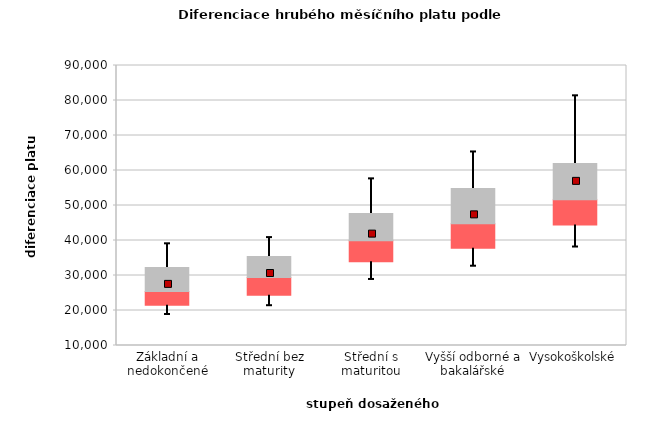
| Category | 0.25 | 0.5 | 0.75 |
|---|---|---|---|
| Základní a nedokončené | 21478.392 | 3965.391 | 6817.841 |
| Střední bez maturity | 24371.354 | 5090.289 | 5994.537 |
| Střední s maturitou | 33926.336 | 6003.744 | 7808.406 |
| Vyšší odborné a bakalářské | 37766.425 | 6996.022 | 10072.324 |
| Vysokoškolské | 44421.594 | 7213.762 | 10337.712 |